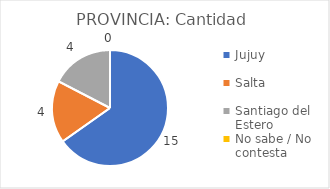
| Category | PROVINCIA: |
|---|---|
| Jujuy  | 0.652 |
| Salta  | 0.174 |
| Santiago del Estero  | 0.174 |
| No sabe / No contesta | 0 |